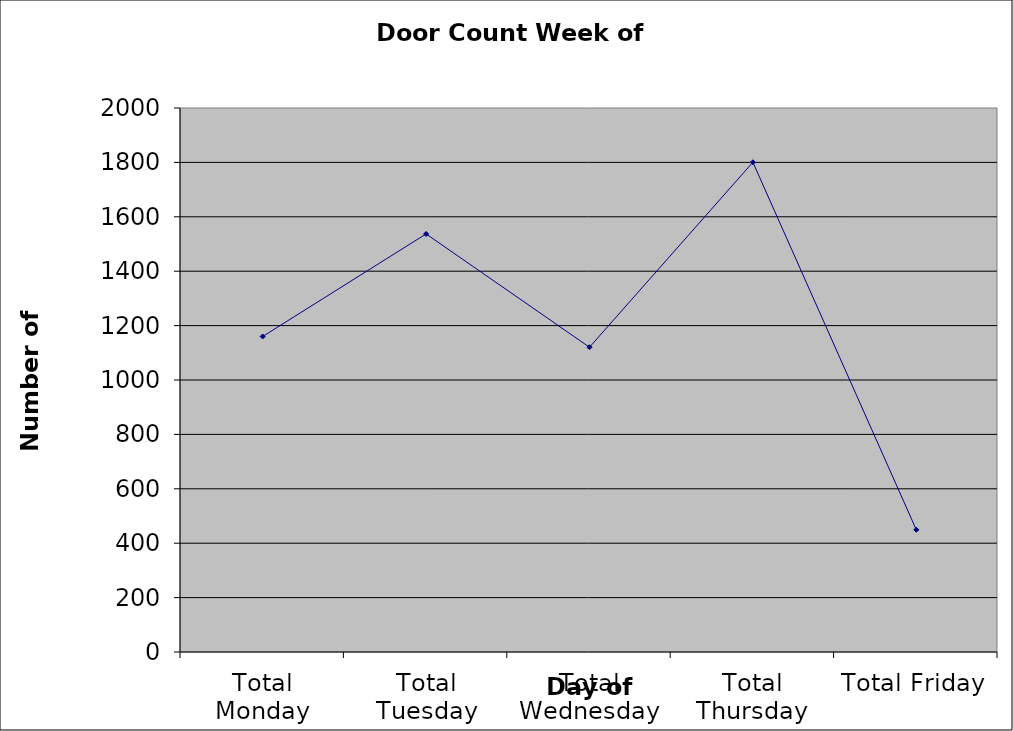
| Category | Series 0 |
|---|---|
| Total Monday | 1160 |
| Total Tuesday | 1537 |
| Total Wednesday | 1120.5 |
| Total Thursday | 1800.5 |
| Total Friday | 449.5 |